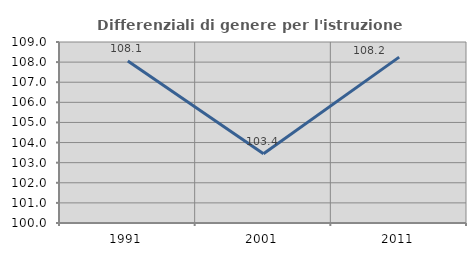
| Category | Differenziali di genere per l'istruzione superiore |
|---|---|
| 1991.0 | 108.055 |
| 2001.0 | 103.439 |
| 2011.0 | 108.249 |